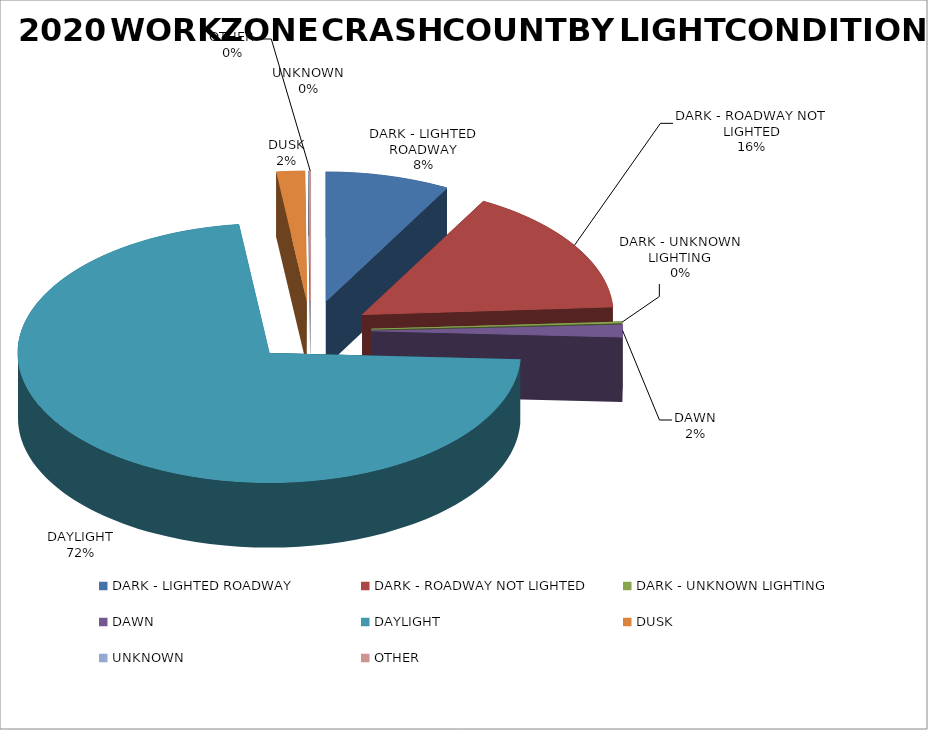
| Category | Series 0 | Series 1 |
|---|---|---|
| DARK - LIGHTED ROADWAY | 476 | 0.08 |
| DARK - ROADWAY NOT LIGHTED | 953 | 0.16 |
| DARK - UNKNOWN LIGHTING | 10 | 0.002 |
| DAWN | 92 | 0.015 |
| DAYLIGHT | 4296 | 0.723 |
| DUSK | 108 | 0.018 |
| UNKNOWN | 5 | 0.001 |
| OTHER | 2 | 0 |